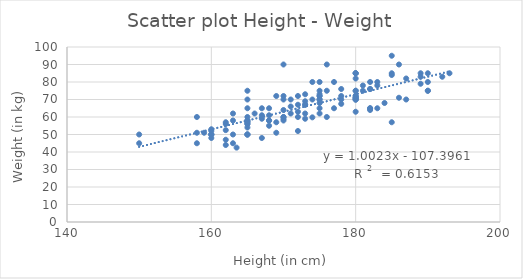
| Category | Series 0 |
|---|---|
| 162.0 | 52.5 |
| 182.0 | 76 |
| 185.0 | 84 |
| 170.0 | 60 |
| 172.0 | 72 |
| 159.0 | 51 |
| 182.0 | 76 |
| 160.0 | 50 |
| 182.0 | 65 |
| 180.0 | 71 |
| 178.0 | 76 |
| 163.0 | 50 |
| 173.0 | 69 |
| 160.0 | 50 |
| 184.0 | 68 |
| 162.0 | 57 |
| 165.0 | 56 |
| 165.0 | 50 |
| 172.0 | 60 |
| 173.0 | 59 |
| 167.0 | 61 |
| 174.0 | 59.8 |
| 173.0 | 73 |
| 171.0 | 66 |
| 177.0 | 65 |
| 170.0 | 59 |
| 163.5 | 42.5 |
| 150.0 | 45 |
| 175.0 | 65 |
| 180.0 | 70 |
| 172.0 | 67 |
| 185.0 | 85 |
| 167.0 | 48 |
| 165.0 | 57 |
| 165.0 | 58 |
| 163.0 | 58 |
| 183.0 | 78 |
| 165.0 | 50 |
| 180.0 | 71 |
| 171.0 | 70 |
| 165.0 | 60 |
| 186.0 | 71 |
| 187.0 | 82 |
| 175.0 | 70 |
| 180.0 | 71 |
| 180.0 | 70 |
| 168.0 | 65 |
| 190.0 | 75 |
| 187.0 | 70 |
| 169.0 | 72 |
| 175.0 | 73 |
| 165.0 | 75 |
| 176.0 | 90 |
| 178.0 | 67.5 |
| 165.0 | 70 |
| 174.0 | 70 |
| 175.0 | 70 |
| 158.0 | 45 |
| 175.0 | 80 |
| 190.0 | 80 |
| 178.0 | 72 |
| 166.0 | 62 |
| 180.0 | 82 |
| 189.0 | 85 |
| 190.0 | 75 |
| 168.0 | 61 |
| 180.0 | 85 |
| 182.0 | 80 |
| 180.0 | 85 |
| 175.0 | 62 |
| 183.0 | 80 |
| 180.0 | 85 |
| 175.0 | 75 |
| 180.0 | 72 |
| 175.0 | 68 |
| 180.0 | 72 |
| 180.0 | 70 |
| 162.0 | 56 |
| 186.0 | 90 |
| 168.0 | 55 |
| 181.0 | 75 |
| 158.0 | 60 |
| 178.0 | 70 |
| 175.0 | 72 |
| 162.0 | 44 |
| 158.0 | 51 |
| 176.0 | 60 |
| 172.0 | 63 |
| 180.0 | 63 |
| 171.0 | 62 |
| 165.0 | 54 |
| 182.0 | 65 |
| 165.0 | 65 |
| 165.0 | 57 |
| 185.0 | 57 |
| 165.0 | 50 |
| 173.0 | 67 |
| 170.0 | 72 |
| 189.0 | 79 |
| 170.0 | 64 |
| 185.0 | 95 |
| 165.0 | 58 |
| 189.0 | 83 |
| 180.0 | 75 |
| 192.0 | 83 |
| 193.0 | 85 |
| 165.0 | 56 |
| 170.0 | 60 |
| 167.0 | 59 |
| 170.0 | 90 |
| 168.0 | 58 |
| 169.0 | 51 |
| 170.0 | 70 |
| 176.0 | 75 |
| 173.0 | 67 |
| 163.0 | 45 |
| 162.0 | 47 |
| 150.0 | 50 |
| 175.0 | 72 |
| 183.0 | 65 |
| 167.0 | 65 |
| 170.0 | 58 |
| 181.0 | 78 |
| 169.0 | 57 |
| 172.0 | 52 |
| 160.0 | 48 |
| 173.0 | 62 |
| 182.0 | 64 |
| 168.0 | 58 |
| 163.0 | 62 |
| 160.0 | 53 |
| 180.0 | 75 |
| 177.0 | 80 |
| 174.0 | 80 |
| 160.0 | 50 |
| 160.0 | 52 |
| 190.0 | 85 |